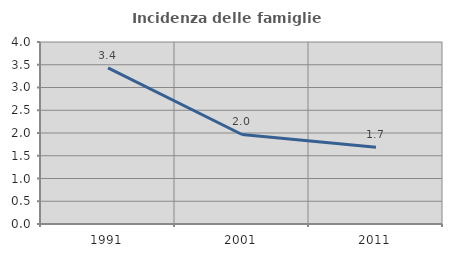
| Category | Incidenza delle famiglie numerose |
|---|---|
| 1991.0 | 3.431 |
| 2001.0 | 1.967 |
| 2011.0 | 1.686 |